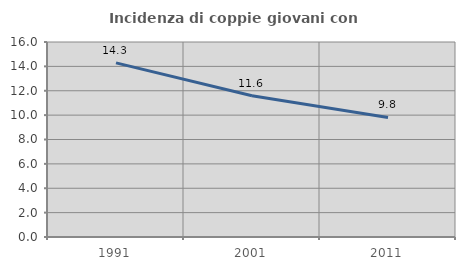
| Category | Incidenza di coppie giovani con figli |
|---|---|
| 1991.0 | 14.286 |
| 2001.0 | 11.594 |
| 2011.0 | 9.808 |